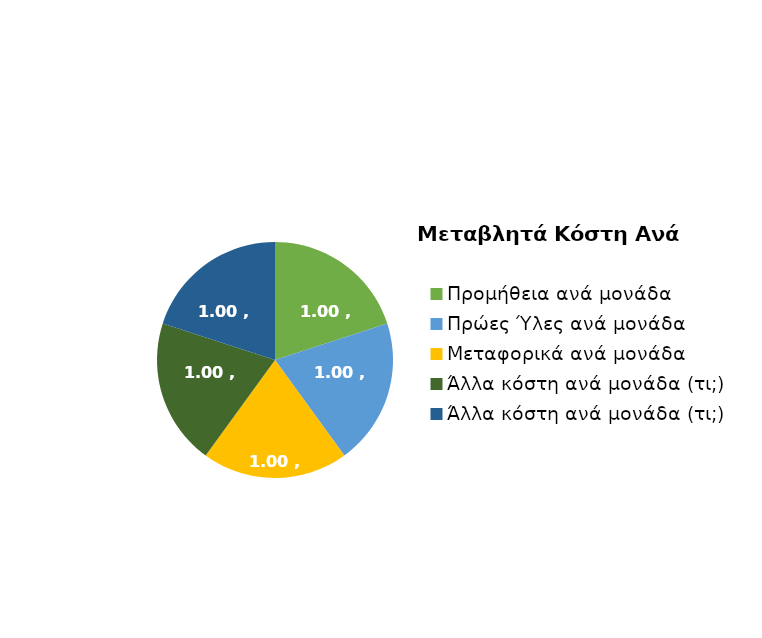
| Category | Series 0 |
|---|---|
| Προμήθεια ανά μονάδα | 1 |
| Πρώες Ύλες ανά μονάδα | 1 |
| Μεταφορικά ανά μονάδα | 1 |
| Άλλα κόστη ανά μονάδα (τι;) | 1 |
| Άλλα κόστη ανά μονάδα (τι;) | 1 |